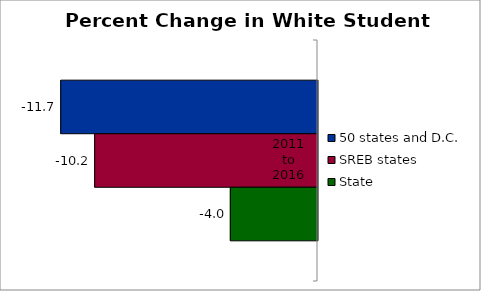
| Category | 50 states and D.C. | SREB states | State |
|---|---|---|---|
| 2011 to 2016 | -11.711 | -10.163 | -3.975 |